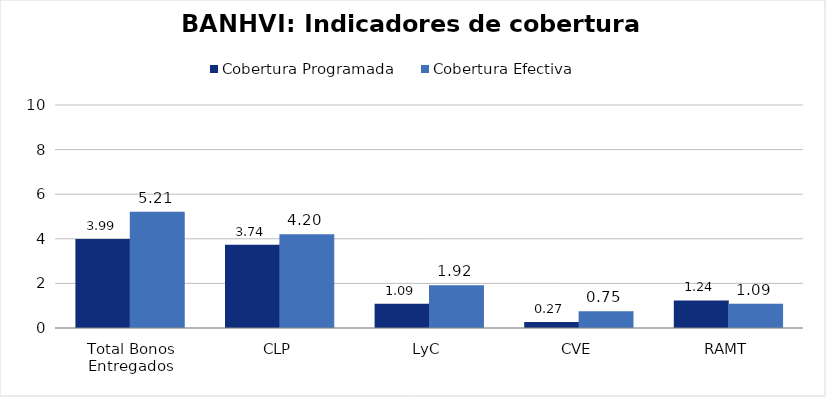
| Category | Cobertura Programada | Cobertura Efectiva |
|---|---|---|
| Total Bonos Entregados | 3.988 | 5.211 |
| CLP | 3.736 | 4.203 |
| LyC | 1.088 | 1.917 |
| CVE | 0.271 | 0.751 |
| RAMT | 1.238 | 1.085 |